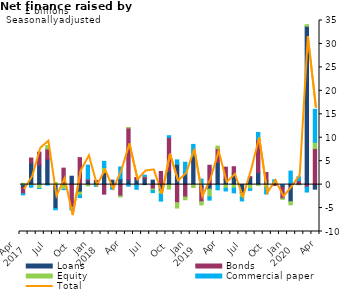
| Category | Loans | Bonds | Equity | Commercial paper |
|---|---|---|---|---|
| Apr 
2017 | -0.597 | -1.325 | 0.278 |  |
|  | 4.624 | 1.039 | -0.185 |  |
|  | 4.149 | 2.776 | -0.825 |  |
| Jul | 5.384 | 2.237 | 0.697 |  |
|  | -5.091 | 0.002 | 0.446 |  |
|  | -0.137 | 3.51 | -0.89 |  |
| Oct | 1.787 | -4.847 | -0.363 |  |
|  | -1.601 | 5.749 | -0.672 |  |
|  | 0.816 | 0.379 | -0.274 |  |
| Jan 
2018 | 0.802 | 0.093 | -0.253 |  |
|  | 2.636 | -2.027 | 1.014 |  |
|  | 0.943 | -0.433 | -0.202 |  |
| Apr | 1.23 | -2.435 | -0.194 |  |
|  | 1.044 | 11.031 | 0.117 |  |
|  | 1.227 | 0.294 | -0.029 |  |
| Jul | 1.25 | 0.494 | 0.035 |  |
|  | 0.957 | -0.932 | -0.341 |  |
|  | -1.319 | 2.795 | -0.715 |  |
| Oct | 2.923 | 7.138 | -0.946 |  |
|  | 4.312 | -3.846 | -1.152 |  |
|  | 2.369 | -2.65 | -0.583 |  |
| Jan 
2019 | 6.099 | 0.161 | -0.612 |  |
|  | -0.575 | -3.084 | -0.675 |  |
|  | -0.959 | 4.131 | -1.669 |  |
| Apr | 4.721 | 2.92 | 0.577 |  |
|  | 1.097 | 2.622 | -0.798 |  |
|  | 2.373 | 1.437 | -0.753 |  |
| Jul | -1.601 | -0.281 | -0.859 |  |
|  | 1.533 | 0.174 | -0.878 |  |
|  | 2.591 | 6.981 | -0.138 |  |
| Oct | 0.921 | 1.651 | -0.578 |  |
|  | 0.34 | -0.195 | 0.025 |  |
|  | -0.576 | -2.415 | -0.142 |  |
| Jan 
2020 | -3.628 | 0.155 | -0.691 |  |
|  | 0.089 | 0.764 | -0.007 |  |
|  | 33.775 | -0.54 | 0.327 |  |
| Apr | -0.965 | 7.688 | 1.355 |  |